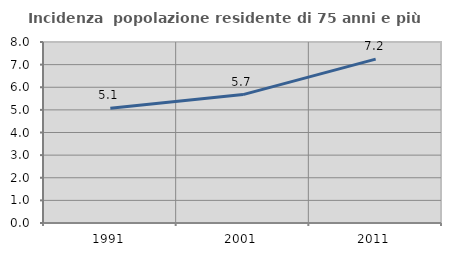
| Category | Incidenza  popolazione residente di 75 anni e più |
|---|---|
| 1991.0 | 5.07 |
| 2001.0 | 5.675 |
| 2011.0 | 7.245 |